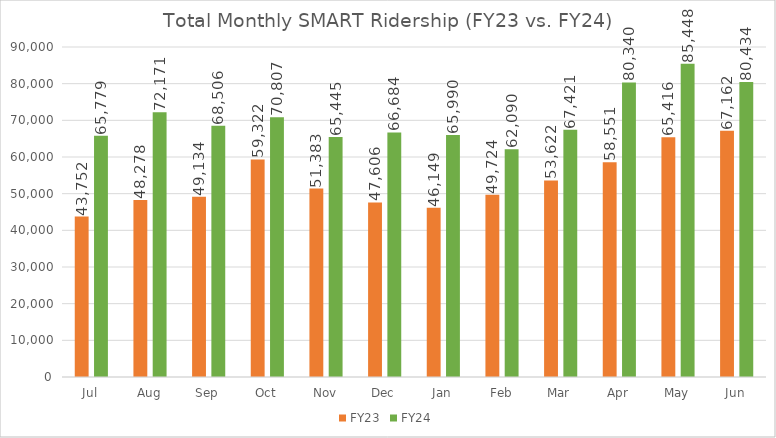
| Category | FY23 | FY24 |
|---|---|---|
| Jul | 43752 | 65779 |
| Aug | 48278 | 72171 |
| Sep | 49134 | 68506 |
| Oct | 59322 | 70807 |
| Nov | 51383 | 65445 |
| Dec | 47606 | 66684 |
| Jan | 46149 | 65990 |
| Feb | 49724 | 62090 |
| Mar | 53622 | 67421 |
| Apr | 58551 | 80340 |
| May | 65416 | 85448 |
| Jun | 67162 | 80434 |